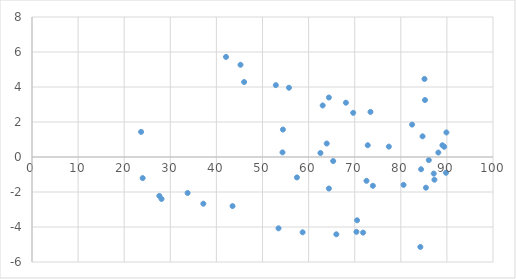
| Category | Series 0 |
|---|---|
| 64.40084843818721 | 3.399 |
| 52.89280002698624 | 4.107 |
| 80.59343611715659 | -1.593 |
| 89.8975872909435 | 1.402 |
| 23.665031745114902 | 1.435 |
| 62.57043811035811 | 0.23 |
| 68.09769742787532 | 3.102 |
| 28.097134310187784 | -2.397 |
| 63.92953596111954 | 0.77 |
| 77.40627817918138 | 0.594 |
| 89.41681933719062 | 0.583 |
| 70.51644612104428 | -3.616 |
| 70.37724344238458 | -4.277 |
| 84.24056203761523 | -5.141 |
| 71.8205844633076 | -4.321 |
| 82.44901500603476 | 1.851 |
| 88.14558185697689 | 0.254 |
| 84.40040588280843 | -0.7 |
| 85.13990561842488 | 4.46 |
| 27.62295231099722 | -2.223 |
| 43.504216991564874 | -2.804 |
| 55.74118698532709 | 3.959 |
| 72.56090581704626 | -1.361 |
| 54.431359054358296 | 1.569 |
| 89.02897388834816 | 0.671 |
| 69.67557643947342 | 2.524 |
| 53.4751153047213 | -4.075 |
| 64.40084843818721 | -1.801 |
| 84.71862486480921 | 1.181 |
| 57.4675556191296 | -1.168 |
| 33.756189731764835 | -2.056 |
| 42.08159189004914 | 5.718 |
| 63.05419224353773 | 2.946 |
| 73.9455896906843 | -1.646 |
| 86.07547269637152 | -0.175 |
| 58.703865646011934 | -4.304 |
| 87.2972365491735 | -1.297 |
| 24.006628819587945 | -1.207 |
| 85.45363810188525 | -1.754 |
| 73.42243596474887 | 2.578 |
| 45.22937794122808 | 5.271 |
| 66.0175452802159 | -4.418 |
| 87.14607903909723 | -0.946 |
| 72.82751779200629 | 0.672 |
| 65.33082974150199 | -0.231 |
| 85.24469388414354 | 3.255 |
| 37.168887419030256 | -2.669 |
| 54.336523287280784 | 0.263 |
| 89.80178916775276 | -0.902 |
| 46.01524802706646 | 4.285 |